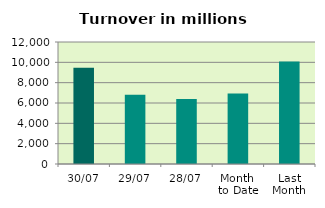
| Category | Series 0 |
|---|---|
| 30/07 | 9475.631 |
| 29/07 | 6806.864 |
| 28/07 | 6402.503 |
| Month 
to Date | 6941.723 |
| Last
Month | 10085.686 |